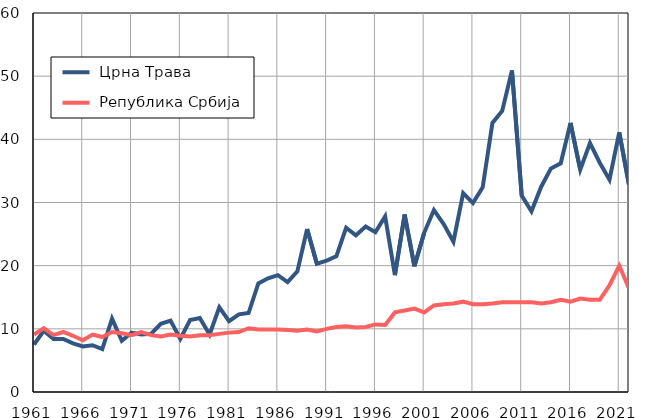
| Category |  Црна Трава |  Република Србија |
|---|---|---|
| 1961.0 | 7.5 | 9.1 |
| 1962.0 | 9.7 | 10.1 |
| 1963.0 | 8.4 | 9 |
| 1964.0 | 8.4 | 9.5 |
| 1965.0 | 7.7 | 8.9 |
| 1966.0 | 7.2 | 8.2 |
| 1967.0 | 7.4 | 9.1 |
| 1968.0 | 6.8 | 8.7 |
| 1969.0 | 11.6 | 9.5 |
| 1970.0 | 8.1 | 9.3 |
| 1971.0 | 9.4 | 9 |
| 1972.0 | 9.1 | 9.5 |
| 1973.0 | 9.2 | 9 |
| 1974.0 | 10.8 | 8.8 |
| 1975.0 | 11.3 | 9.1 |
| 1976.0 | 8.4 | 8.9 |
| 1977.0 | 11.4 | 8.8 |
| 1978.0 | 11.7 | 9 |
| 1979.0 | 9.1 | 9 |
| 1980.0 | 13.4 | 9.2 |
| 1981.0 | 11.2 | 9.4 |
| 1982.0 | 12.3 | 9.5 |
| 1983.0 | 12.5 | 10.1 |
| 1984.0 | 17.2 | 9.9 |
| 1985.0 | 18 | 9.9 |
| 1986.0 | 18.5 | 9.9 |
| 1987.0 | 17.4 | 9.8 |
| 1988.0 | 19.1 | 9.7 |
| 1989.0 | 25.8 | 9.9 |
| 1990.0 | 20.3 | 9.6 |
| 1991.0 | 20.8 | 10 |
| 1992.0 | 21.5 | 10.3 |
| 1993.0 | 26 | 10.4 |
| 1994.0 | 24.8 | 10.2 |
| 1995.0 | 26.2 | 10.3 |
| 1996.0 | 25.3 | 10.7 |
| 1997.0 | 27.8 | 10.6 |
| 1998.0 | 18.5 | 12.6 |
| 1999.0 | 28.1 | 12.9 |
| 2000.0 | 19.9 | 13.2 |
| 2001.0 | 25.2 | 12.6 |
| 2002.0 | 28.8 | 13.7 |
| 2003.0 | 26.6 | 13.9 |
| 2004.0 | 23.8 | 14 |
| 2005.0 | 31.5 | 14.3 |
| 2006.0 | 29.9 | 13.9 |
| 2007.0 | 32.4 | 13.9 |
| 2008.0 | 42.6 | 14 |
| 2009.0 | 44.5 | 14.2 |
| 2010.0 | 50.9 | 14.2 |
| 2011.0 | 31.1 | 14.2 |
| 2012.0 | 28.6 | 14.2 |
| 2013.0 | 32.5 | 14 |
| 2014.0 | 35.4 | 14.2 |
| 2015.0 | 36.2 | 14.6 |
| 2016.0 | 42.6 | 14.3 |
| 2017.0 | 35.2 | 14.8 |
| 2018.0 | 39.4 | 14.6 |
| 2019.0 | 36.3 | 14.6 |
| 2020.0 | 33.6 | 16.9 |
| 2021.0 | 41.1 | 20 |
| 2022.0 | 32.8 | 16.4 |